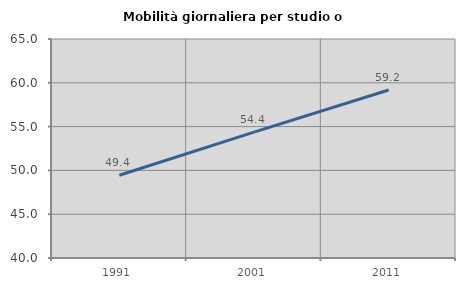
| Category | Mobilità giornaliera per studio o lavoro |
|---|---|
| 1991.0 | 49.446 |
| 2001.0 | 54.363 |
| 2011.0 | 59.178 |